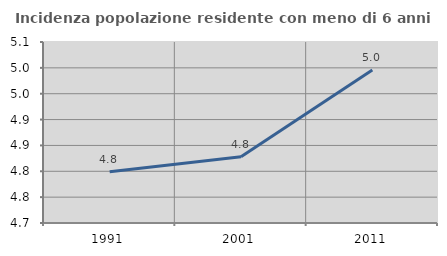
| Category | Incidenza popolazione residente con meno di 6 anni |
|---|---|
| 1991.0 | 4.799 |
| 2001.0 | 4.828 |
| 2011.0 | 4.996 |